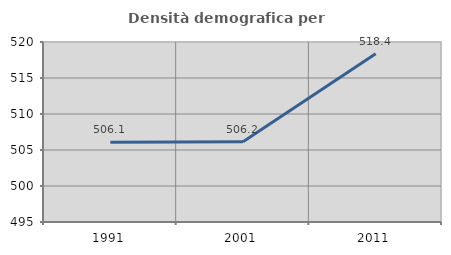
| Category | Densità demografica |
|---|---|
| 1991.0 | 506.084 |
| 2001.0 | 506.15 |
| 2011.0 | 518.365 |